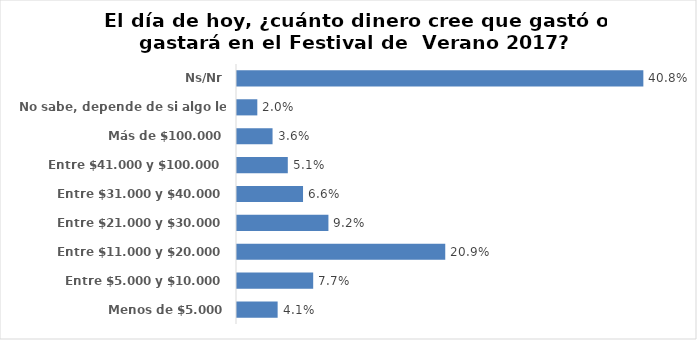
| Category | Series 0 |
|---|---|
| Menos de $5.000 | 0.041 |
| Entre $5.000 y $10.000 | 0.077 |
| Entre $11.000 y $20.000 | 0.209 |
| Entre $21.000 y $30.000 | 0.092 |
| Entre $31.000 y $40.000 | 0.066 |
| Entre $41.000 y $100.000 | 0.051 |
| Más de $100.000 | 0.036 |
| No sabe, depende de si algo le gusta | 0.02 |
| Ns/Nr | 0.408 |